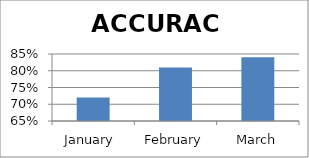
| Category | ACCURACY |
|---|---|
| January  | 0.72 |
| February | 0.81 |
| March | 0.84 |